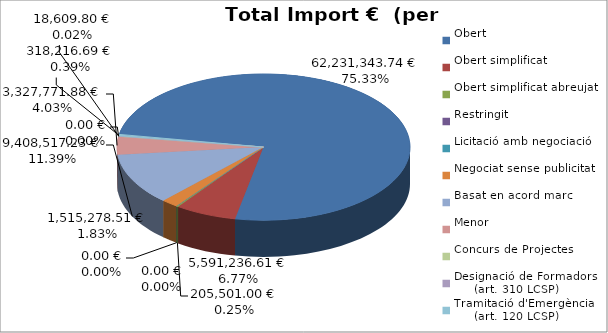
| Category | Total preu
(amb IVA) |
|---|---|
| Obert | 62231343.737 |
| Obert simplificat | 5591236.615 |
| Obert simplificat abreujat | 205501 |
| Restringit | 0 |
| Licitació amb negociació | 0 |
| Negociat sense publicitat | 1515278.513 |
| Basat en acord marc | 9408517.229 |
| Menor | 3327771.878 |
| Concurs de Projectes | 0 |
| Designació de Formadors
     (art. 310 LCSP) | 18609.8 |
| Tramitació d'Emergència
     (art. 120 LCSP) | 318216.69 |